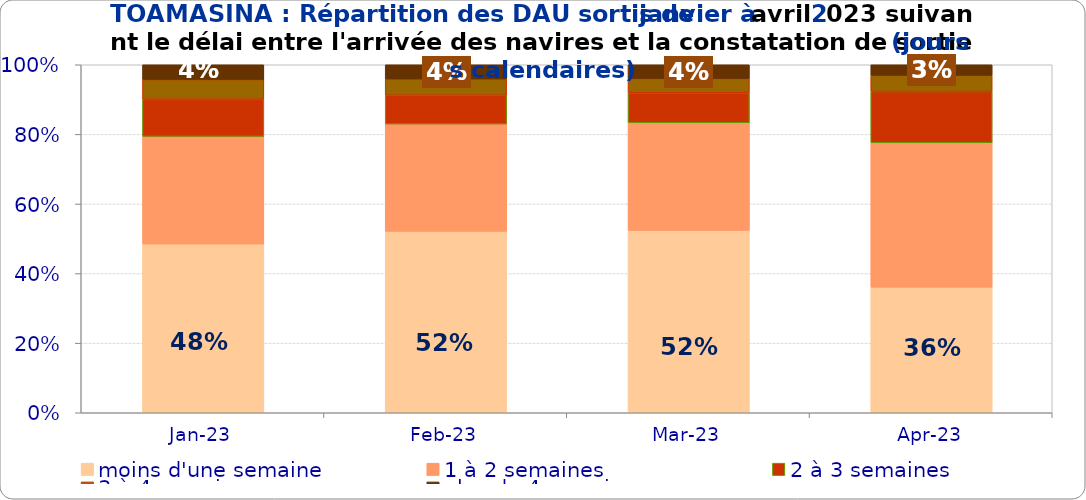
| Category | moins d'une semaine | 1 à 2 semaines | 2 à 3 semaines | 3 à 4 semaines | plus de 4 semaines |
|---|---|---|---|---|---|
| 2023-01-01 | 0.485 | 0.31 | 0.107 | 0.057 | 0.042 |
| 2023-02-01 | 0.521 | 0.309 | 0.083 | 0.047 | 0.041 |
| 2023-03-01 | 0.524 | 0.309 | 0.086 | 0.041 | 0.039 |
| 2023-04-01 | 0.361 | 0.415 | 0.147 | 0.047 | 0.03 |